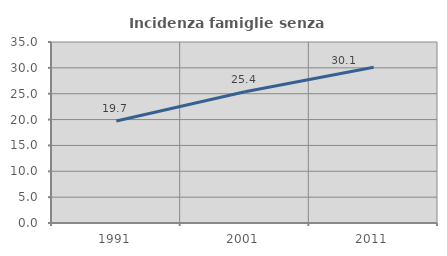
| Category | Incidenza famiglie senza nuclei |
|---|---|
| 1991.0 | 19.715 |
| 2001.0 | 25.368 |
| 2011.0 | 30.11 |